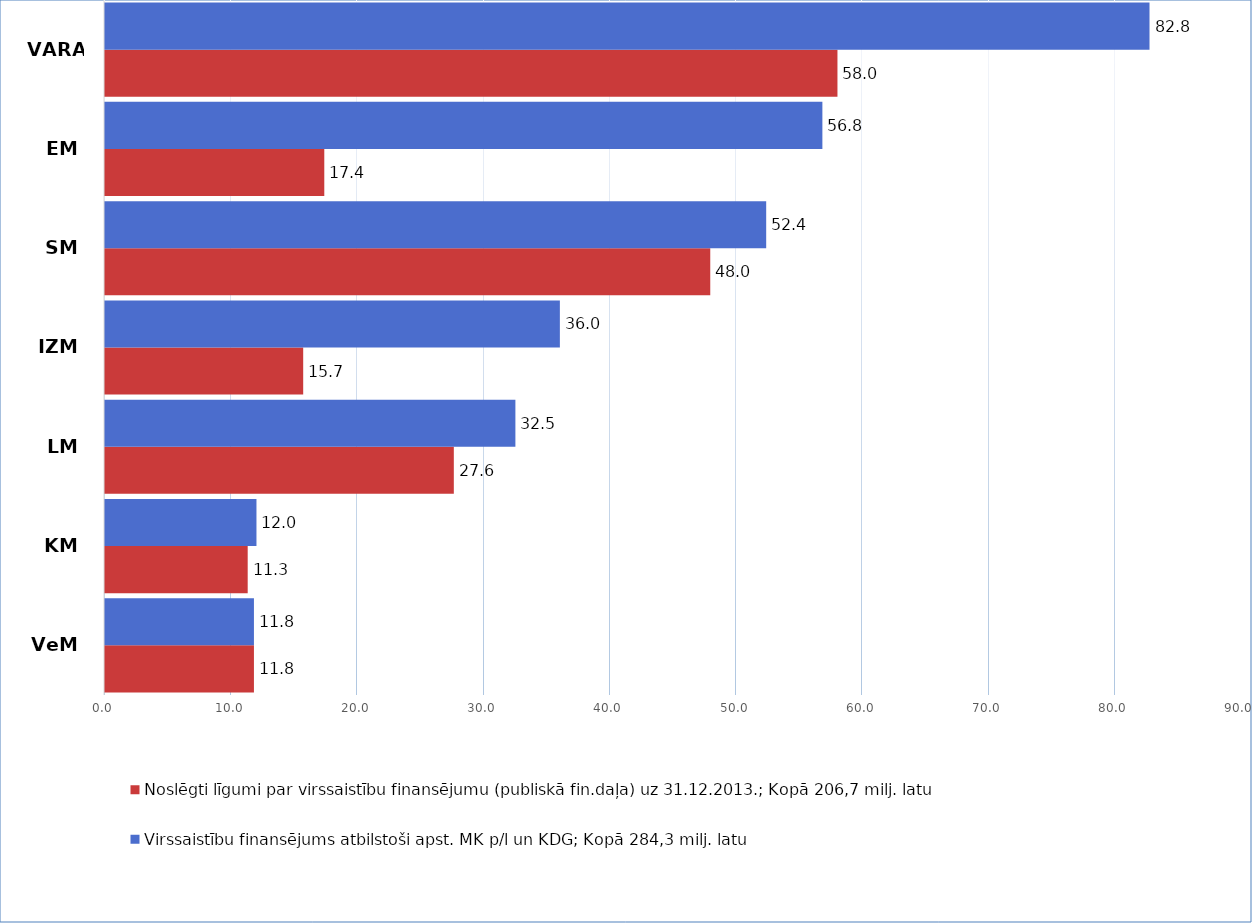
| Category | Noslēgti līgumi par virssaistību finansējumu (publiskā fin.daļa) uz 31.12.2013.; Kopā 206,7 milj. latu | Virssaistību finansējums atbilstoši apst. MK p/l un KDG; Kopā 284,3 milj. latu |
|---|---|---|
| VeM | 11800000 | 11800000 |
| KM | 11305417.99 | 12000000 |
| LM | 27635540.93 | 32513923 |
| IZM | 15702084 | 36037210 |
| SM | 47951524 | 52382961 |
| EM | 17373231.12 | 56835208 |
| VARAM | 58029082 | 82751761 |